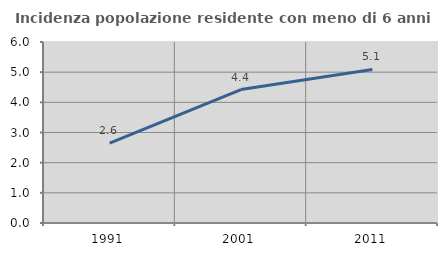
| Category | Incidenza popolazione residente con meno di 6 anni |
|---|---|
| 1991.0 | 2.647 |
| 2001.0 | 4.425 |
| 2011.0 | 5.09 |